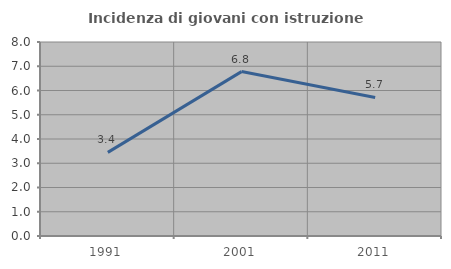
| Category | Incidenza di giovani con istruzione universitaria |
|---|---|
| 1991.0 | 3.448 |
| 2001.0 | 6.78 |
| 2011.0 | 5.714 |